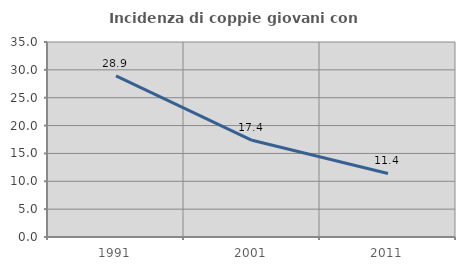
| Category | Incidenza di coppie giovani con figli |
|---|---|
| 1991.0 | 28.926 |
| 2001.0 | 17.352 |
| 2011.0 | 11.398 |